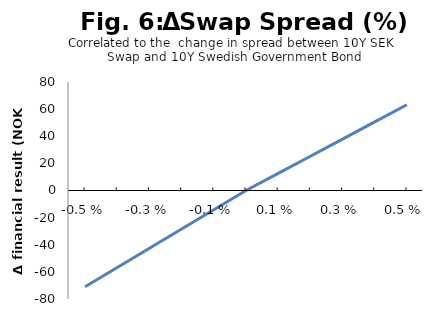
| Category | Series 0 |
|---|---|
| -0.005 | -71.016 |
| -0.004 | -56.813 |
| -0.003 | -42.61 |
| -0.002 | -28.406 |
| -0.001 | -14.203 |
| 0.0 | 0 |
| 0.001 | 12.642 |
| 0.002 | 25.284 |
| 0.003 | 37.925 |
| 0.004 | 50.567 |
| 0.005 | 63.209 |